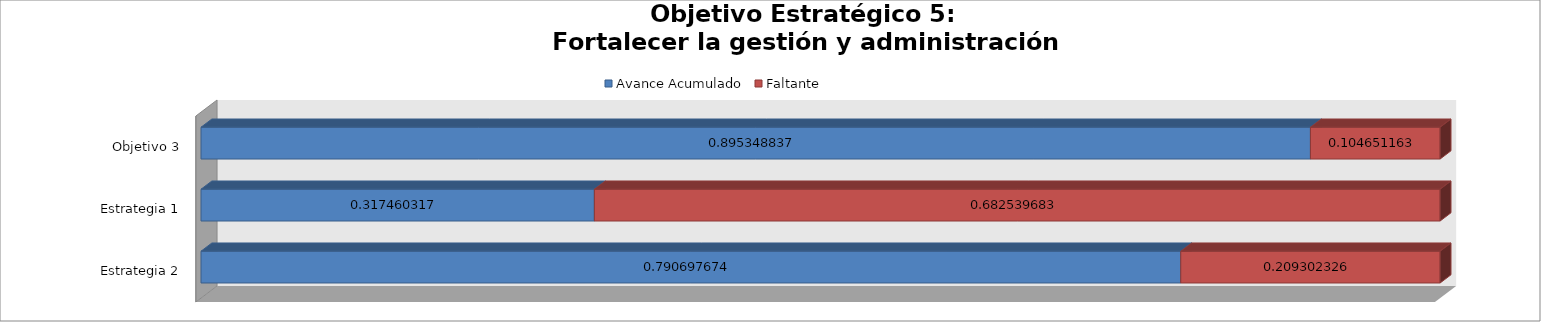
| Category | Avance Acumulado | Faltante |
|---|---|---|
| Estrategia 2 | 0.791 | 0.209 |
| Estrategia 1 | 0.317 | 0.683 |
| Objetivo 3 | 0.895 | 0.105 |